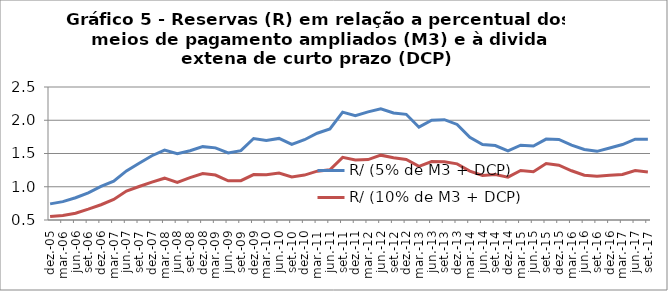
| Category | R/ (5% de M3 + DCP) | R/ (10% de M3 + DCP) |
|---|---|---|
| 2005-12-01 | 0.742 | 0.552 |
| 2006-03-01 | 0.776 | 0.569 |
| 2006-06-01 | 0.835 | 0.603 |
| 2006-09-01 | 0.909 | 0.663 |
| 2006-12-01 | 1.005 | 0.73 |
| 2007-03-01 | 1.084 | 0.808 |
| 2007-06-01 | 1.238 | 0.935 |
| 2007-09-01 | 1.354 | 1.004 |
| 2007-12-01 | 1.466 | 1.069 |
| 2008-03-01 | 1.552 | 1.129 |
| 2008-06-01 | 1.496 | 1.065 |
| 2008-09-01 | 1.541 | 1.137 |
| 2008-12-01 | 1.603 | 1.198 |
| 2009-03-01 | 1.585 | 1.176 |
| 2009-06-01 | 1.508 | 1.089 |
| 2009-09-01 | 1.543 | 1.091 |
| 2009-12-01 | 1.725 | 1.183 |
| 2010-03-01 | 1.697 | 1.181 |
| 2010-06-01 | 1.727 | 1.205 |
| 2010-09-01 | 1.636 | 1.147 |
| 2010-12-01 | 1.707 | 1.175 |
| 2011-03-01 | 1.805 | 1.234 |
| 2011-06-01 | 1.868 | 1.256 |
| 2011-09-01 | 2.122 | 1.442 |
| 2011-12-01 | 2.068 | 1.402 |
| 2012-03-01 | 2.126 | 1.409 |
| 2012-06-01 | 2.173 | 1.475 |
| 2012-09-01 | 2.109 | 1.435 |
| 2012-12-01 | 2.089 | 1.41 |
| 2013-03-01 | 1.896 | 1.306 |
| 2013-06-01 | 2 | 1.378 |
| 2013-09-01 | 2.008 | 1.377 |
| 2013-12-01 | 1.937 | 1.344 |
| 2014-03-01 | 1.743 | 1.236 |
| 2014-06-01 | 1.634 | 1.169 |
| 2014-09-01 | 1.62 | 1.182 |
| 2014-12-01 | 1.538 | 1.144 |
| 2015-03-01 | 1.625 | 1.245 |
| 2015-06-01 | 1.613 | 1.226 |
| 2015-09-01 | 1.716 | 1.35 |
| 2015-12-01 | 1.711 | 1.324 |
| 2016-03-01 | 1.626 | 1.24 |
| 2016-06-01 | 1.561 | 1.173 |
| 2016-09-01 | 1.532 | 1.157 |
| 2016-12-01 | 1.583 | 1.171 |
| 2017-03-01 | 1.634 | 1.186 |
| 2017-06-01 | 1.715 | 1.244 |
| 2017-09-01 | 1.714 | 1.221 |